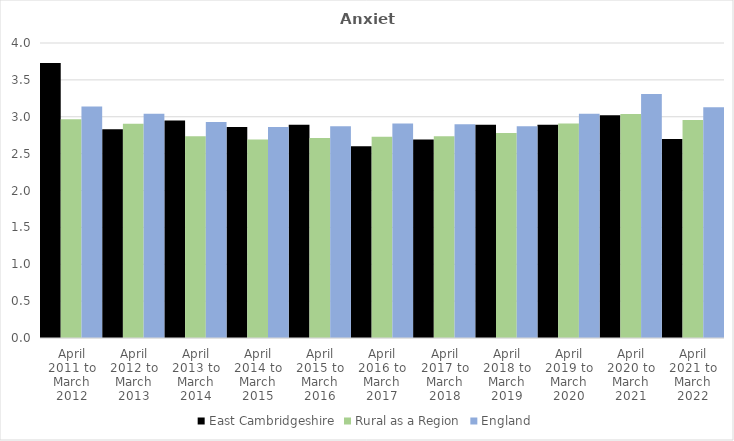
| Category | East Cambridgeshire | Rural as a Region | England |
|---|---|---|---|
| April 2011 to March 2012 | 3.73 | 2.967 | 3.14 |
| April 2012 to March 2013 | 2.83 | 2.904 | 3.04 |
| April 2013 to March 2014 | 2.95 | 2.734 | 2.93 |
| April 2014 to March 2015 | 2.86 | 2.691 | 2.86 |
| April 2015 to March 2016 | 2.89 | 2.711 | 2.87 |
| April 2016 to March 2017 | 2.6 | 2.729 | 2.91 |
| April 2017 to March 2018 | 2.69 | 2.736 | 2.9 |
| April 2018 to March 2019 | 2.89 | 2.78 | 2.87 |
| April 2019 to March 2020 | 2.89 | 2.908 | 3.04 |
| April 2020 to March 2021 | 3.02 | 3.036 | 3.31 |
| April 2021 to March 2022 | 2.7 | 2.956 | 3.13 |